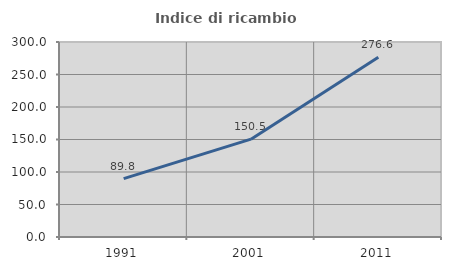
| Category | Indice di ricambio occupazionale  |
|---|---|
| 1991.0 | 89.758 |
| 2001.0 | 150.501 |
| 2011.0 | 276.623 |